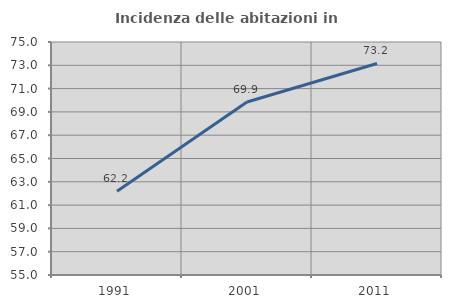
| Category | Incidenza delle abitazioni in proprietà  |
|---|---|
| 1991.0 | 62.197 |
| 2001.0 | 69.852 |
| 2011.0 | 73.159 |